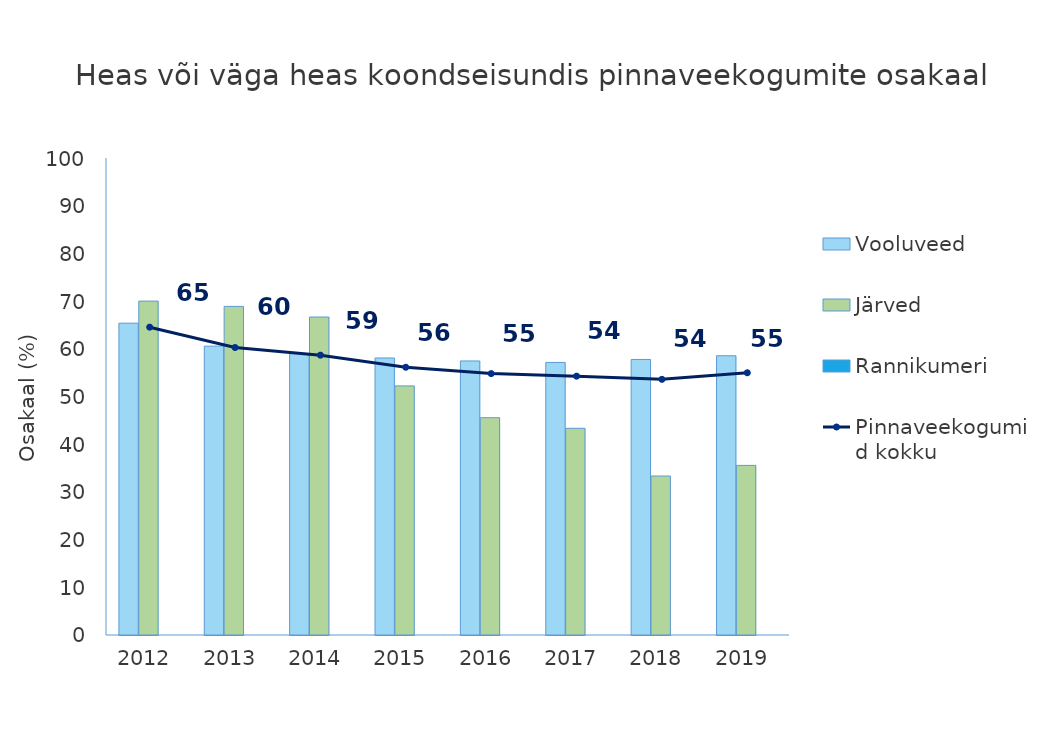
| Category | Vooluveed | Järved | Rannikumeri |
|---|---|---|---|
| 2012.0 | 65.373 | 70 | 0 |
| 2013.0 | 60.559 | 68.889 | 0 |
| 2014.0 | 59.006 | 66.667 | 0 |
| 2015.0 | 58.075 | 52.222 | 0 |
| 2016.0 | 57.453 | 45.556 | 0 |
| 2017.0 | 57.143 | 43.333 | 0 |
| 2018.0 | 57.764 | 33.333 | 0 |
| 2019.0 | 58.54 | 35.556 | 0 |